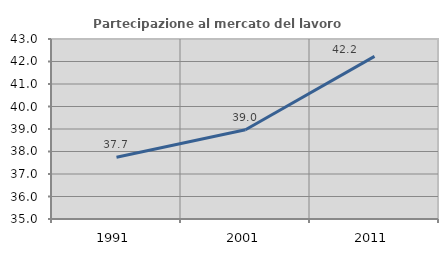
| Category | Partecipazione al mercato del lavoro  femminile |
|---|---|
| 1991.0 | 37.744 |
| 2001.0 | 38.966 |
| 2011.0 | 42.228 |